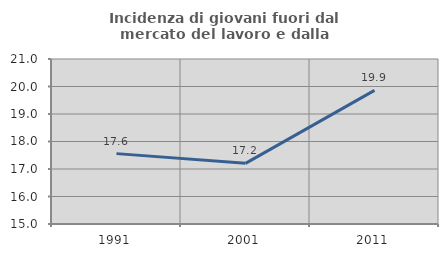
| Category | Incidenza di giovani fuori dal mercato del lavoro e dalla formazione  |
|---|---|
| 1991.0 | 17.559 |
| 2001.0 | 17.206 |
| 2011.0 | 19.859 |